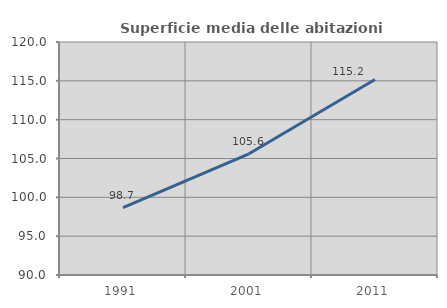
| Category | Superficie media delle abitazioni occupate |
|---|---|
| 1991.0 | 98.665 |
| 2001.0 | 105.607 |
| 2011.0 | 115.179 |